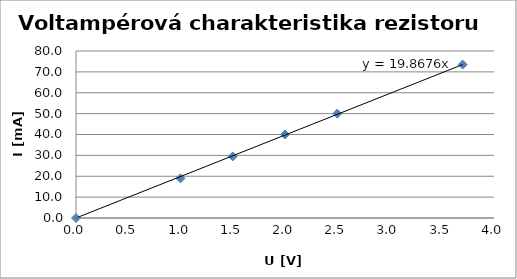
| Category | I [mA] |
|---|---|
| 0.0 | 0 |
| 1.0 | 19 |
| 1.5 | 29.5 |
| 2.0 | 40 |
| 2.5 | 50 |
| 3.7 | 73.5 |